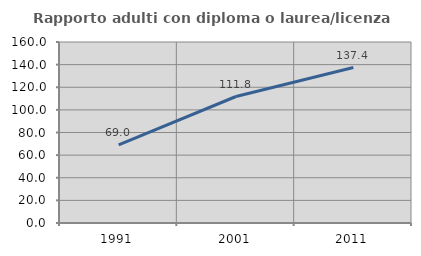
| Category | Rapporto adulti con diploma o laurea/licenza media  |
|---|---|
| 1991.0 | 69.048 |
| 2001.0 | 111.818 |
| 2011.0 | 137.405 |